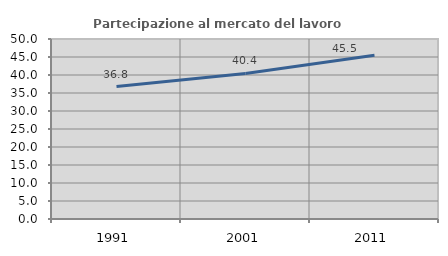
| Category | Partecipazione al mercato del lavoro  femminile |
|---|---|
| 1991.0 | 36.787 |
| 2001.0 | 40.43 |
| 2011.0 | 45.489 |